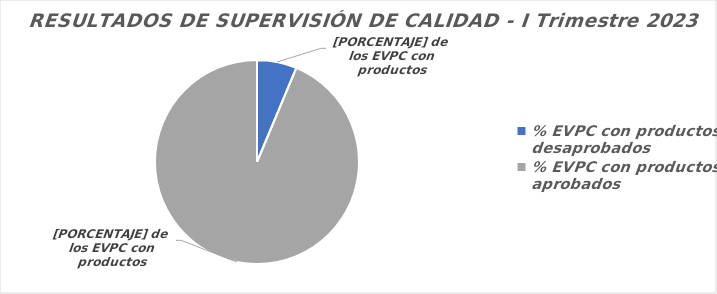
| Category | RESULTADOS DE SUPERVISIÓN DE CALIDAD |
|---|---|
| % EVPC con productos desaprobados | 8 |
| % EVPC con productos aprobados | 119 |